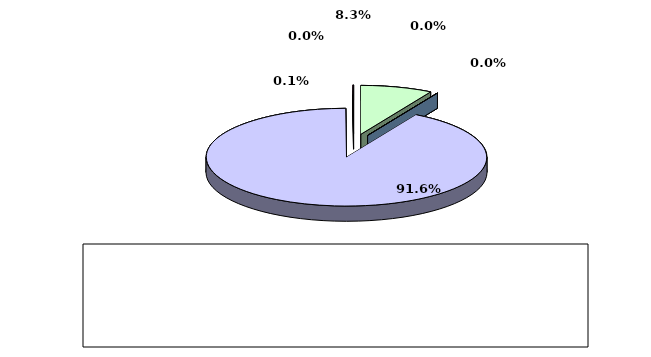
| Category | Series 0 |
|---|---|
| מזומנים ושווי מזומנים | 0.083 |
| אג"ח ממשלתיות סחירות | 0 |
| אג"ח קונצרני סחיר | 0 |
| ני"ע אחרים סחירים | 0.916 |
| פקדונות והלוואות | 0 |
| השקעות אחרות | 0.001 |